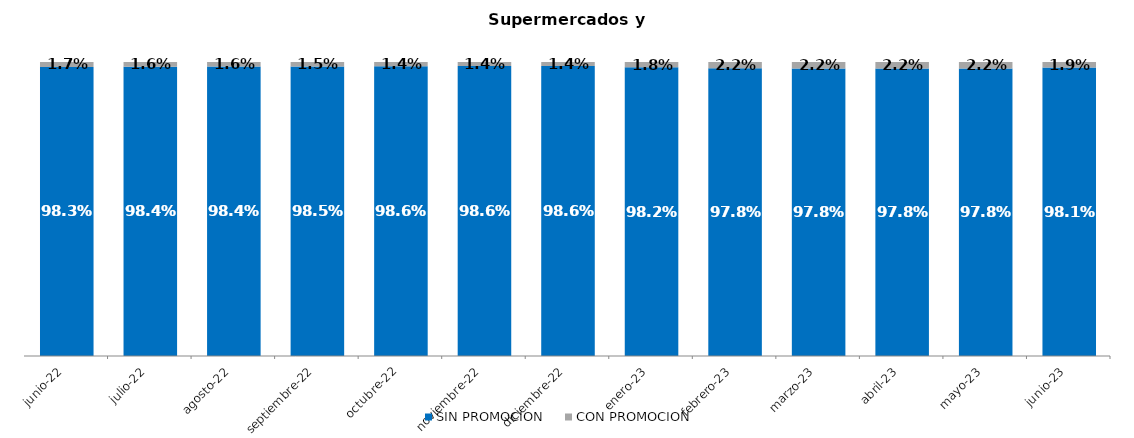
| Category | SIN PROMOCION   | CON PROMOCION   |
|---|---|---|
| 2022-06-01 | 0.983 | 0.017 |
| 2022-07-01 | 0.984 | 0.016 |
| 2022-08-01 | 0.984 | 0.016 |
| 2022-09-01 | 0.985 | 0.015 |
| 2022-10-01 | 0.986 | 0.014 |
| 2022-11-01 | 0.986 | 0.014 |
| 2022-12-01 | 0.986 | 0.014 |
| 2023-01-01 | 0.982 | 0.018 |
| 2023-02-01 | 0.978 | 0.022 |
| 2023-03-01 | 0.978 | 0.022 |
| 2023-04-01 | 0.978 | 0.022 |
| 2023-05-01 | 0.978 | 0.022 |
| 2023-06-01 | 0.981 | 0.019 |